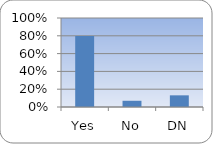
| Category | Series 0 |
|---|---|
| Yes | 0.799 |
| No | 0.07 |
| DN | 0.131 |